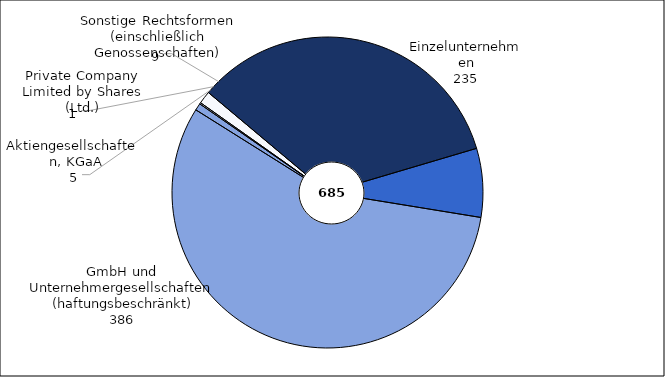
| Category | Series 0 |
|---|---|
| Einzelunternehmen | 235 |
| Personengesellschaften (OHG, KG, GbR) | 49 |
| Gesellschaften m.b.H. (einschließlich Unternehmergesellschaften (haftungsbeschränkt)) | 386 |
| Aktiengesellschaften, KGaA | 5 |
| Private Company Limited by Shares (Ltd.) | 1 |
| Sonstige Rechtsformen (einschließlich Genossenschaften) | 9 |